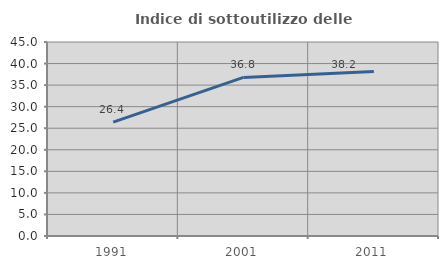
| Category | Indice di sottoutilizzo delle abitazioni  |
|---|---|
| 1991.0 | 26.42 |
| 2001.0 | 36.78 |
| 2011.0 | 38.167 |